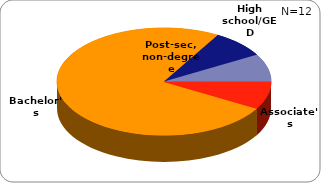
| Category | Series 0 |
|---|---|
| High school/GED | 0.083 |
| Post-sec, non-degree | 0.083 |
| Associate's | 0.083 |
| Bachelor's | 0.75 |